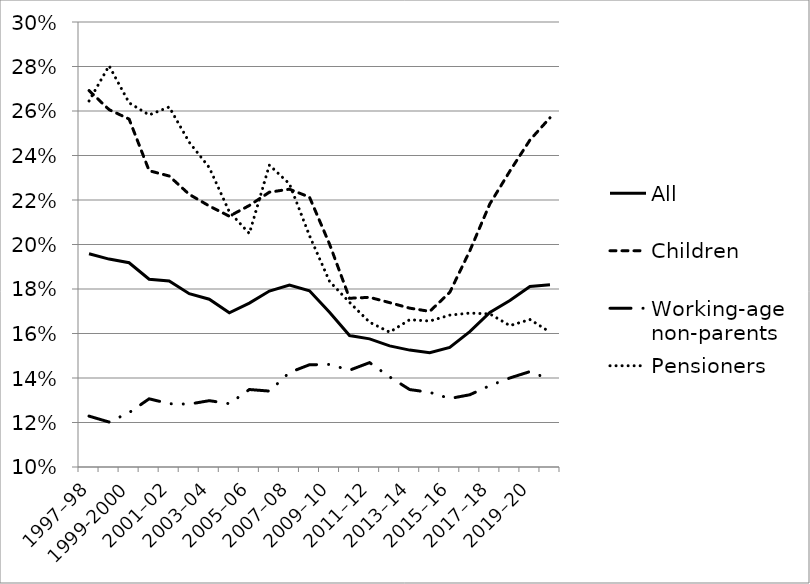
| Category | All | Children | Working-age non-parents | Pensioners |
|---|---|---|---|---|
| 1997–98 | 0.196 | 0.269 | 0.123 | 0.265 |
| 1998–99 | 0.193 | 0.261 | 0.12 | 0.28 |
| 1999-2000 | 0.192 | 0.256 | 0.124 | 0.264 |
| 2000–01 | 0.184 | 0.233 | 0.131 | 0.258 |
| 2001–02 | 0.184 | 0.231 | 0.128 | 0.262 |
| 2002–03 | 0.178 | 0.223 | 0.128 | 0.246 |
| 2003–04 | 0.175 | 0.217 | 0.13 | 0.235 |
| 2004–05 | 0.169 | 0.213 | 0.128 | 0.215 |
| 2005–06 | 0.174 | 0.218 | 0.135 | 0.205 |
| 2006–07 | 0.179 | 0.224 | 0.134 | 0.236 |
| 2007–08 | 0.182 | 0.225 | 0.142 | 0.227 |
| 2008–09 | 0.179 | 0.221 | 0.146 | 0.204 |
| 2009–10 | 0.17 | 0.2 | 0.146 | 0.183 |
| 2010–11 | 0.159 | 0.176 | 0.144 | 0.174 |
| 2011–12 | 0.158 | 0.176 | 0.147 | 0.165 |
| 2012–13 | 0.154 | 0.174 | 0.14 | 0.161 |
| 2013–14 | 0.153 | 0.171 | 0.135 | 0.166 |
| 2014–15 | 0.151 | 0.17 | 0.134 | 0.166 |
| 2015–16 | 0.154 | 0.178 | 0.131 | 0.168 |
| 2016–17 | 0.161 | 0.197 | 0.132 | 0.169 |
| 2017–18 | 0.169 | 0.218 | 0.137 | 0.169 |
| 2018–19 | 0.175 | 0.233 | 0.14 | 0.164 |
| 2019–20 | 0.181 | 0.247 | 0.143 | 0.166 |
| 2020–21 | 0.182 | 0.257 | 0.139 | 0.161 |